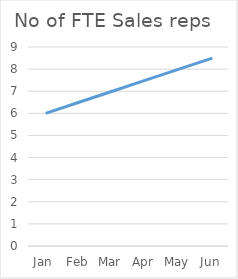
| Category | No of FTE Sales reps  |
|---|---|
| Jan | 6 |
| Feb | 6.5 |
| Mar | 7 |
| Apr | 7.5 |
| May | 8 |
| Jun | 8.5 |